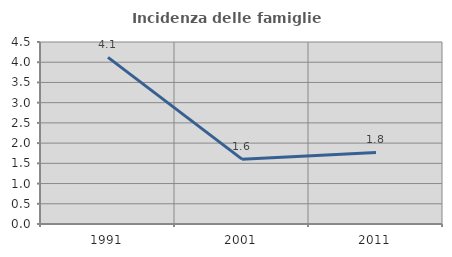
| Category | Incidenza delle famiglie numerose |
|---|---|
| 1991.0 | 4.119 |
| 2001.0 | 1.603 |
| 2011.0 | 1.769 |